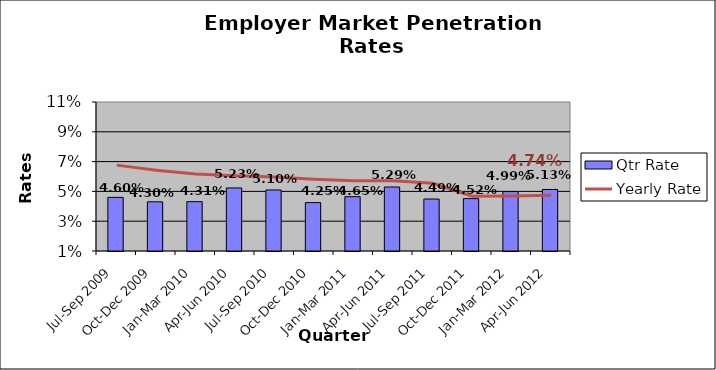
| Category | Qtr Rate |
|---|---|
| Jul-Sep 2009 | 0.046 |
| Oct-Dec 2009 | 0.043 |
| Jan-Mar 2010 | 0.043 |
| Apr-Jun 2010 | 0.052 |
| Jul-Sep 2010 | 0.051 |
| Oct-Dec 2010 | 0.042 |
| Jan-Mar 2011 | 0.046 |
| Apr-Jun 2011 | 0.053 |
| Jul-Sep 2011 | 0.045 |
| Oct-Dec 2011 | 0.045 |
| Jan-Mar 2012 | 0.05 |
| Apr-Jun 2012 | 0.051 |